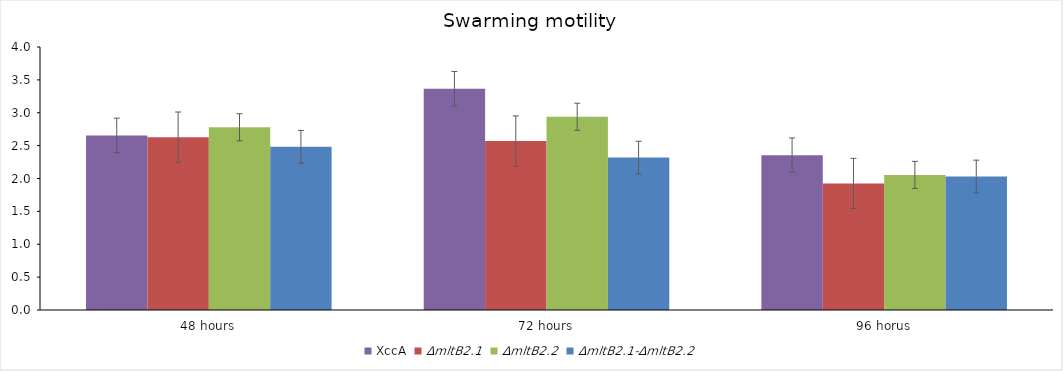
| Category | XccA | ΔmltB2.1 | ΔmltB2.2 | ΔmltB2.1-ΔmltB2.2 |
|---|---|---|---|---|
| 48 hours | 2.656 | 2.629 | 2.779 | 2.482 |
| 72 hours | 3.365 | 2.57 | 2.94 | 2.318 |
| 96 horus | 2.355 | 1.925 | 2.055 | 2.03 |